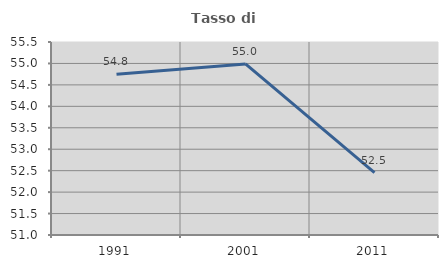
| Category | Tasso di occupazione   |
|---|---|
| 1991.0 | 54.75 |
| 2001.0 | 54.988 |
| 2011.0 | 52.453 |